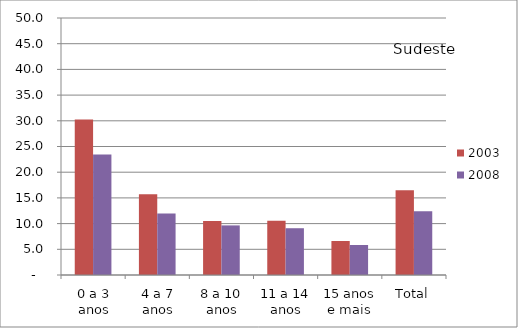
| Category | 2003 | 2008 |
|---|---|---|
| 0 a 3 anos | 30.25 | 23.46 |
| 4 a 7 anos | 15.73 | 11.95 |
| 8 a 10 anos | 10.52 | 9.65 |
| 11 a 14 anos | 10.54 | 9.1 |
| 15 anos e mais | 6.61 | 5.84 |
| Total | 16.51 | 12.38 |